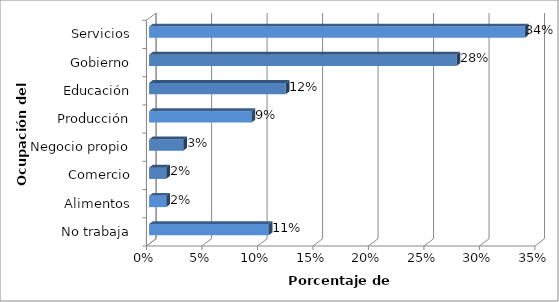
| Category | Series 0 |
|---|---|
| No trabaja | 0.108 |
| Alimentos | 0.015 |
| Comercio | 0.015 |
| Negocio propio | 0.031 |
| Producción | 0.092 |
| Educación | 0.123 |
| Gobierno | 0.277 |
| Servicios | 0.338 |